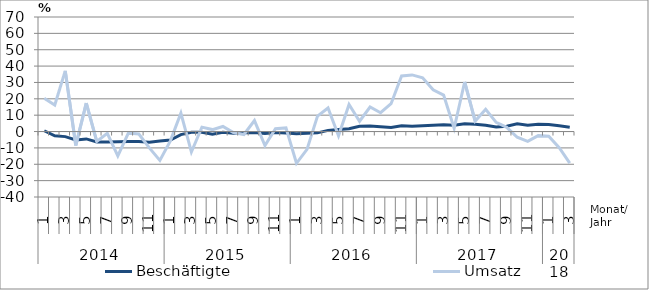
| Category | Beschäftigte | Umsatz |
|---|---|---|
| 0 | 0.5 | 20.3 |
| 1 | -2.6 | 16.2 |
| 2 | -3.1 | 37.1 |
| 3 | -5.1 | -8.5 |
| 4 | -4.5 | 17.4 |
| 5 | -6.4 | -6.1 |
| 6 | -6.4 | -1.1 |
| 7 | -6.2 | -14.9 |
| 8 | -6.1 | -0.9 |
| 9 | -6.1 | -1.5 |
| 10 | -6.6 | -10 |
| 11 | -5.8 | -17.6 |
| 12 | -5.2 | -5.7 |
| 13 | -1.9 | 11.2 |
| 14 | -0.5 | -12.5 |
| 15 | -0.5 | 2.7 |
| 16 | -1.7 | 1.2 |
| 17 | -0.5 | 3.1 |
| 18 | -1.1 | -0.6 |
| 19 | -0.8 | -1.8 |
| 20 | -0.6 | 6.7 |
| 21 | -1.2 | -8.6 |
| 22 | -0.6 | 1.7 |
| 23 | -0.9 | 2.2 |
| 24 | -1.3 | -19.4 |
| 25 | -1.1 | -10.9 |
| 26 | -0.8 | 9.4 |
| 27 | 0.7 | 14.4 |
| 28 | 1.2 | -2.6 |
| 29 | 1.7 | 16.5 |
| 30 | 3.2 | 6.3 |
| 31 | 3.4 | 15 |
| 32 | 3 | 11.5 |
| 33 | 2.5 | 17 |
| 34 | 3.6 | 34 |
| 35 | 3.2 | 34.6 |
| 36 | 3.5 | 32.8 |
| 37 | 3.8 | 25.5 |
| 38 | 4.2 | 22.3 |
| 39 | 3.9 | 2 |
| 40 | 4.7 | 30.3 |
| 41 | 4.4 | 6.4 |
| 42 | 3.9 | 13.6 |
| 43 | 2.8 | 5.6 |
| 44 | 3.3 | 2.6 |
| 45 | 4.7 | -3.5 |
| 46 | 3.8 | -6 |
| 47 | 4.4 | -2.5 |
| 48 | 4.3 | -2.8 |
| 49 | 3.5 | -9.9 |
| 50 | 2.6 | -19.3 |